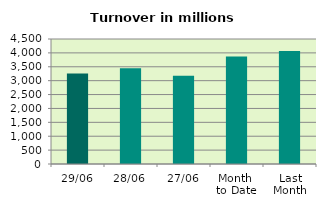
| Category | Series 0 |
|---|---|
| 29/06 | 3258.87 |
| 28/06 | 3451.482 |
| 27/06 | 3176.173 |
| Month 
to Date | 3872.216 |
| Last
Month | 4067.502 |